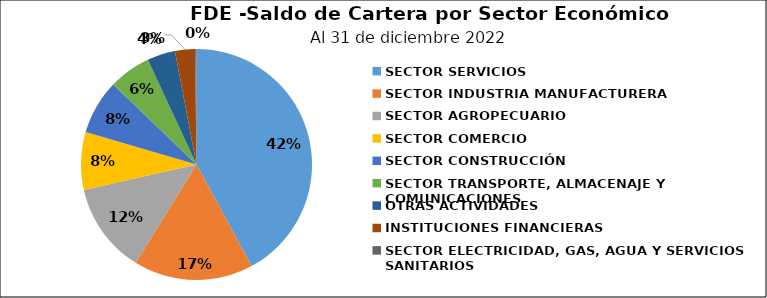
| Category | Saldo | Créditos |
|---|---|---|
| SECTOR SERVICIOS | 22.183 | 306 |
| SECTOR INDUSTRIA MANUFACTURERA | 8.813 | 146 |
| SECTOR AGROPECUARIO | 6.663 | 93 |
| SECTOR COMERCIO | 4.25 | 213 |
| SECTOR CONSTRUCCIÓN | 4.032 | 22 |
| SECTOR TRANSPORTE, ALMACENAJE Y COMUNICACIONES | 3.112 | 14 |
| OTRAS ACTIVIDADES | 2.069 | 11 |
| INSTITUCIONES FINANCIERAS | 1.478 | 5 |
| SECTOR ELECTRICIDAD, GAS, AGUA Y SERVICIOS SANITARIOS | 0.1 | 2 |